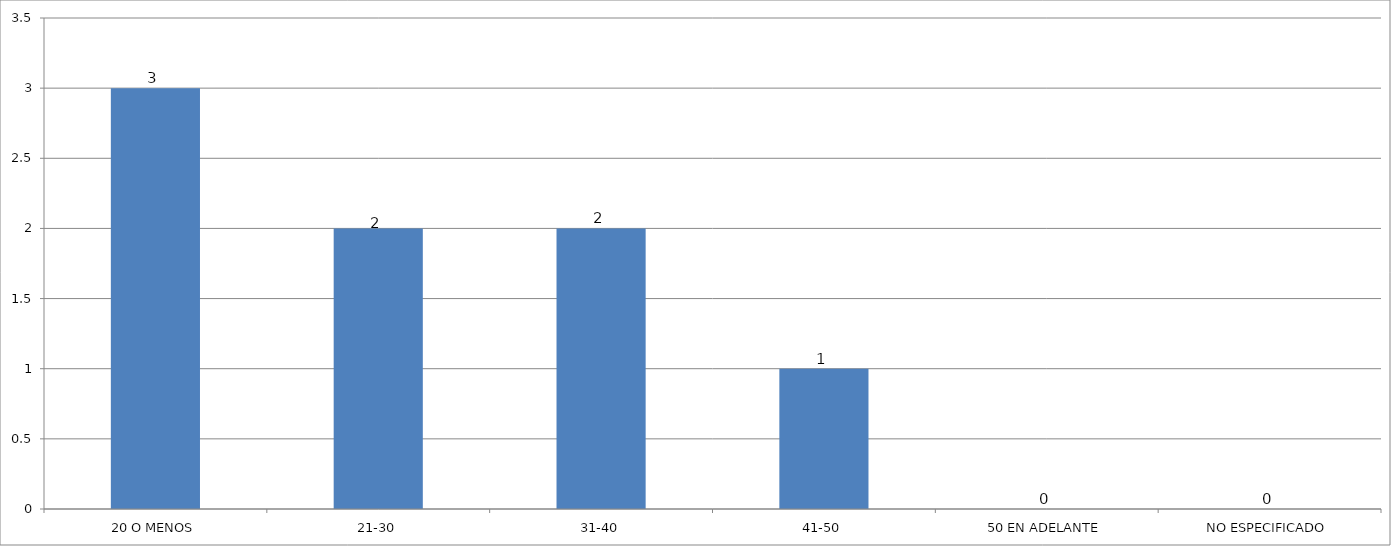
| Category | Series 0 |
|---|---|
| 20 O MENOS | 3 |
| 21-30 | 2 |
| 31-40 | 2 |
| 41-50 | 1 |
| 50 EN ADELANTE | 0 |
| NO ESPECIFICADO | 0 |